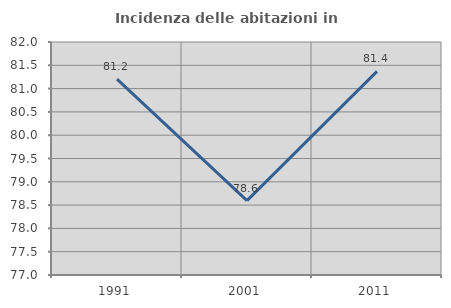
| Category | Incidenza delle abitazioni in proprietà  |
|---|---|
| 1991.0 | 81.203 |
| 2001.0 | 78.596 |
| 2011.0 | 81.369 |